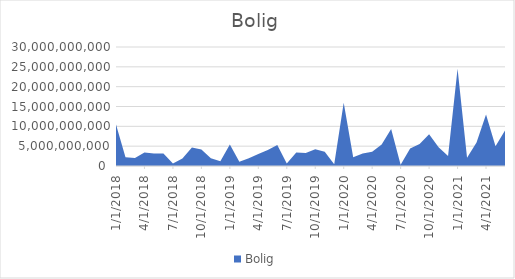
| Category | Bolig |
|---|---|
| 1/1/18 | 10493100000 |
| 2/1/18 | 2217400000 |
| 3/1/18 | 2021445000 |
| 4/1/18 | 3427410000 |
| 5/1/18 | 3125850000 |
| 6/1/18 | 3141800000 |
| 7/1/18 | 627000000 |
| 8/1/18 | 1901400000 |
| 9/1/18 | 4680300000 |
| 10/1/18 | 4173250000 |
| 11/1/18 | 1949800000 |
| 12/1/18 | 1217750000 |
| 1/1/19 | 5423550000 |
| 2/1/19 | 1049950000 |
| 3/1/19 | 1934500000 |
| 4/1/19 | 3037650000 |
| 5/1/19 | 4027500000 |
| 6/1/19 | 5322900000 |
| 7/1/19 | 640000000 |
| 8/1/19 | 3387950000 |
| 9/1/19 | 3297500000 |
| 10/1/19 | 4247500000 |
| 11/1/19 | 3616000000 |
| 12/1/19 | 434000000 |
| 1/1/20 | 15915350000 |
| 2/1/20 | 2182750000 |
| 3/1/20 | 3152300000 |
| 4/1/20 | 3595250000 |
| 5/1/20 | 5442500000 |
| 6/1/20 | 9320200000 |
| 7/1/20 | 300500000 |
| 8/1/20 | 4383200000 |
| 9/1/20 | 5515050000 |
| 10/1/20 | 7978000000 |
| 11/1/20 | 4724800000 |
| 12/1/20 | 2521000000 |
| 1/1/21 | 24505500000 |
| 2/1/21 | 2050250000 |
| 3/1/21 | 5930500000 |
| 4/1/21 | 12970250000 |
| 5/1/21 | 4949500000 |
| 6/1/21 | 8929000000 |